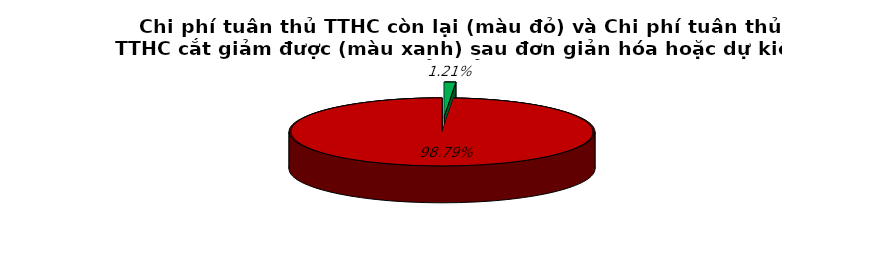
| Category | 1.2% 98.8% |
|---|---|
| 0 | 0.012 |
| 1 | 0.988 |